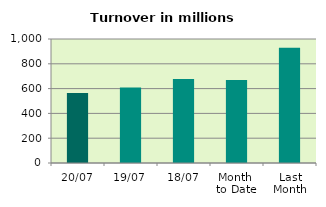
| Category | Series 0 |
|---|---|
| 20/07 | 565.463 |
| 19/07 | 609.217 |
| 18/07 | 678.242 |
| Month 
to Date | 669.466 |
| Last
Month | 929.439 |